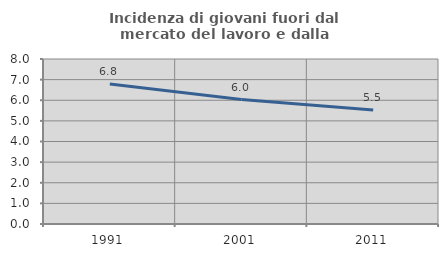
| Category | Incidenza di giovani fuori dal mercato del lavoro e dalla formazione  |
|---|---|
| 1991.0 | 6.788 |
| 2001.0 | 6.033 |
| 2011.0 | 5.523 |